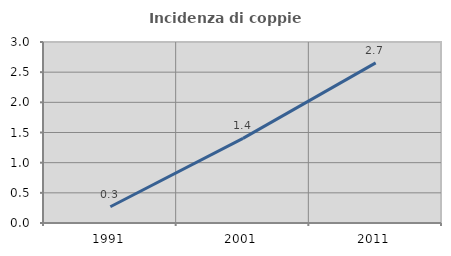
| Category | Incidenza di coppie miste |
|---|---|
| 1991.0 | 0.269 |
| 2001.0 | 1.402 |
| 2011.0 | 2.654 |